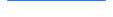
| Category | Series 0 |
|---|---|
| 0 | 41 |
| 1 | 50 |
| 2 | 26 |
| 3 | 26 |
| 4 | 40 |
| 5 | 29 |
| 6 | 26 |
| 7 | 43 |
| 8 | 30 |